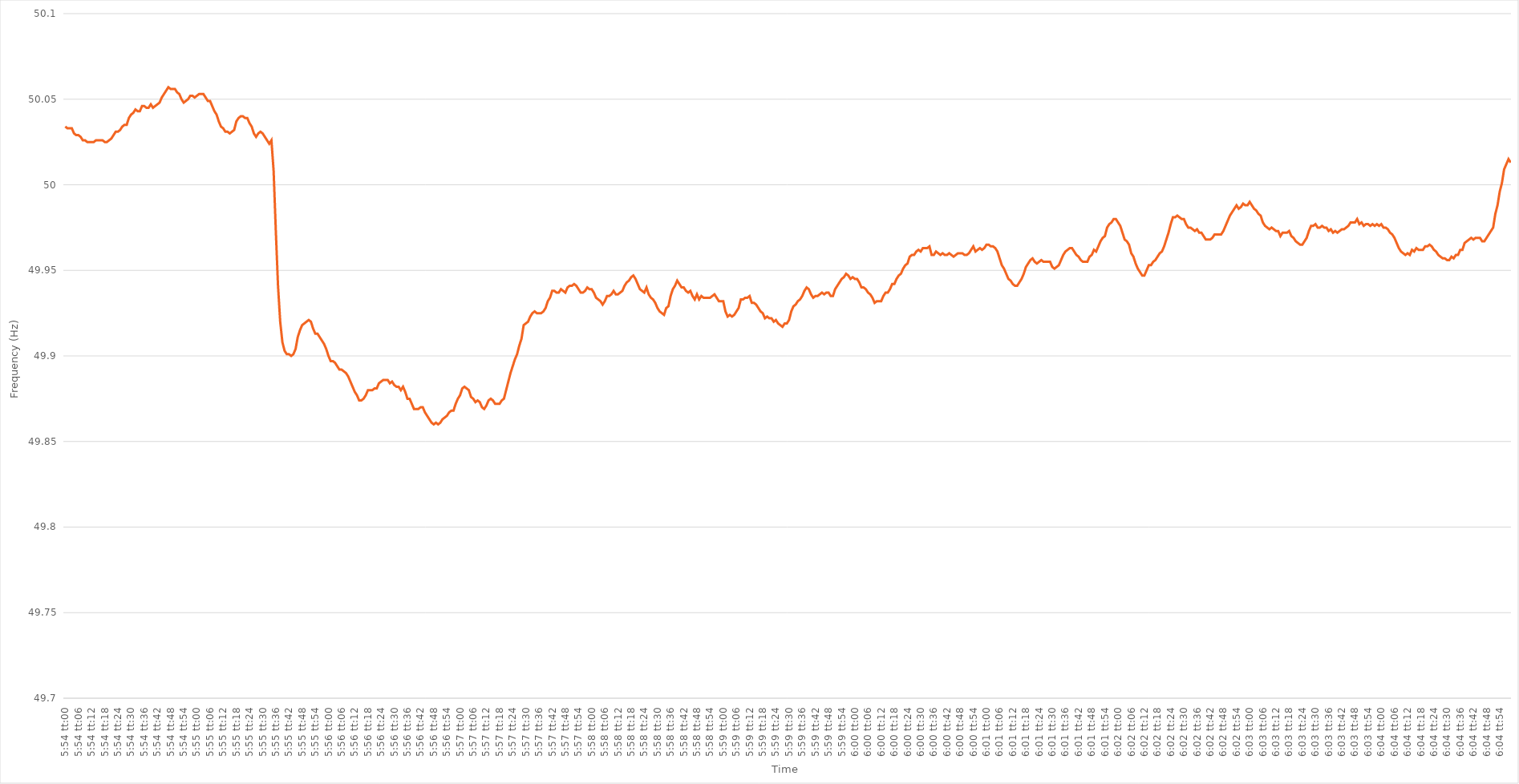
| Category | Series 0 |
|---|---|
| 0.24583333333333335 | 50.034 |
| 0.2458449074074074 | 50.033 |
| 0.2458564814814815 | 50.033 |
| 0.24586805555555555 | 50.033 |
| 0.24587962962962964 | 50.03 |
| 0.24589120370370368 | 50.029 |
| 0.24590277777777778 | 50.029 |
| 0.24591435185185184 | 50.028 |
| 0.2459259259259259 | 50.026 |
| 0.2459375 | 50.026 |
| 0.24594907407407407 | 50.025 |
| 0.24596064814814814 | 50.025 |
| 0.24597222222222223 | 50.025 |
| 0.2459837962962963 | 50.025 |
| 0.24599537037037036 | 50.026 |
| 0.24600694444444446 | 50.026 |
| 0.24601851851851853 | 50.026 |
| 0.2460300925925926 | 50.026 |
| 0.2460416666666667 | 50.025 |
| 0.24605324074074075 | 50.025 |
| 0.24606481481481482 | 50.026 |
| 0.24607638888888891 | 50.027 |
| 0.24608796296296295 | 50.029 |
| 0.24609953703703705 | 50.031 |
| 0.24611111111111109 | 50.031 |
| 0.24612268518518518 | 50.032 |
| 0.24613425925925925 | 50.034 |
| 0.2461458333333333 | 50.035 |
| 0.2461574074074074 | 50.035 |
| 0.24616898148148147 | 50.039 |
| 0.24618055555555554 | 50.041 |
| 0.24619212962962964 | 50.042 |
| 0.2462037037037037 | 50.044 |
| 0.24621527777777777 | 50.043 |
| 0.24622685185185186 | 50.043 |
| 0.24623842592592593 | 50.046 |
| 0.24625 | 50.046 |
| 0.2462615740740741 | 50.045 |
| 0.24627314814814816 | 50.045 |
| 0.24628472222222222 | 50.047 |
| 0.24629629629629632 | 50.045 |
| 0.24630787037037036 | 50.046 |
| 0.24631944444444445 | 50.047 |
| 0.2463310185185185 | 50.048 |
| 0.2463425925925926 | 50.051 |
| 0.24635416666666665 | 50.053 |
| 0.24636574074074072 | 50.055 |
| 0.2463773148148148 | 50.057 |
| 0.24638888888888888 | 50.056 |
| 0.24640046296296295 | 50.056 |
| 0.24641203703703704 | 50.056 |
| 0.2464236111111111 | 50.054 |
| 0.24643518518518517 | 50.053 |
| 0.24644675925925927 | 50.05 |
| 0.24645833333333333 | 50.048 |
| 0.2464699074074074 | 50.049 |
| 0.2464814814814815 | 50.05 |
| 0.24649305555555556 | 50.052 |
| 0.24650462962962963 | 50.052 |
| 0.24651620370370372 | 50.051 |
| 0.2465277777777778 | 50.052 |
| 0.24653935185185186 | 50.053 |
| 0.2465509259259259 | 50.053 |
| 0.24656250000000002 | 50.053 |
| 0.24657407407407406 | 50.051 |
| 0.24658564814814818 | 50.049 |
| 0.24659722222222222 | 50.049 |
| 0.24660879629629628 | 50.046 |
| 0.24662037037037035 | 50.043 |
| 0.24663194444444445 | 50.041 |
| 0.2466435185185185 | 50.037 |
| 0.24665509259259258 | 50.034 |
| 0.24666666666666667 | 50.033 |
| 0.24667824074074074 | 50.031 |
| 0.2466898148148148 | 50.031 |
| 0.2467013888888889 | 50.03 |
| 0.24671296296296297 | 50.031 |
| 0.24672453703703703 | 50.032 |
| 0.24673611111111113 | 50.037 |
| 0.2467476851851852 | 50.039 |
| 0.24675925925925926 | 50.04 |
| 0.24677083333333336 | 50.04 |
| 0.24678240740740742 | 50.039 |
| 0.24679398148148146 | 50.039 |
| 0.24680555555555558 | 50.036 |
| 0.24681712962962962 | 50.034 |
| 0.2468287037037037 | 50.03 |
| 0.24684027777777776 | 50.028 |
| 0.24685185185185185 | 50.03 |
| 0.24686342592592592 | 50.031 |
| 0.24687499999999998 | 50.03 |
| 0.24688657407407408 | 50.028 |
| 0.24689814814814814 | 50.026 |
| 0.2469097222222222 | 50.024 |
| 0.2469212962962963 | 50.026 |
| 0.24693287037037037 | 50.008 |
| 0.24694444444444444 | 49.973 |
| 0.24695601851851853 | 49.941 |
| 0.2469675925925926 | 49.92 |
| 0.24697916666666667 | 49.908 |
| 0.24699074074074076 | 49.903 |
| 0.24700231481481483 | 49.901 |
| 0.2470138888888889 | 49.901 |
| 0.247025462962963 | 49.9 |
| 0.24703703703703703 | 49.901 |
| 0.24704861111111112 | 49.904 |
| 0.24706018518518516 | 49.911 |
| 0.24707175925925925 | 49.915 |
| 0.24708333333333332 | 49.918 |
| 0.2470949074074074 | 49.919 |
| 0.24710648148148148 | 49.92 |
| 0.24711805555555555 | 49.921 |
| 0.24712962962962962 | 49.92 |
| 0.2471412037037037 | 49.916 |
| 0.24715277777777778 | 49.913 |
| 0.24716435185185184 | 49.913 |
| 0.24717592592592594 | 49.911 |
| 0.2471875 | 49.909 |
| 0.24719907407407407 | 49.907 |
| 0.24721064814814817 | 49.904 |
| 0.24722222222222223 | 49.9 |
| 0.2472337962962963 | 49.897 |
| 0.2472453703703704 | 49.897 |
| 0.24725694444444443 | 49.896 |
| 0.24726851851851853 | 49.894 |
| 0.24728009259259257 | 49.892 |
| 0.2472916666666667 | 49.892 |
| 0.24730324074074073 | 49.891 |
| 0.2473148148148148 | 49.89 |
| 0.2473263888888889 | 49.888 |
| 0.24733796296296295 | 49.885 |
| 0.24734953703703702 | 49.882 |
| 0.24736111111111111 | 49.879 |
| 0.24737268518518518 | 49.877 |
| 0.24738425925925925 | 49.874 |
| 0.24739583333333334 | 49.874 |
| 0.2474074074074074 | 49.875 |
| 0.24741898148148148 | 49.877 |
| 0.24743055555555557 | 49.88 |
| 0.24744212962962964 | 49.88 |
| 0.2474537037037037 | 49.88 |
| 0.2474652777777778 | 49.881 |
| 0.24747685185185186 | 49.881 |
| 0.24748842592592593 | 49.884 |
| 0.24749999999999997 | 49.885 |
| 0.2475115740740741 | 49.886 |
| 0.24752314814814813 | 49.886 |
| 0.24753472222222225 | 49.886 |
| 0.2475462962962963 | 49.884 |
| 0.24755787037037036 | 49.885 |
| 0.24756944444444443 | 49.883 |
| 0.24758101851851852 | 49.882 |
| 0.2475925925925926 | 49.882 |
| 0.24760416666666665 | 49.88 |
| 0.24761574074074075 | 49.882 |
| 0.24762731481481481 | 49.879 |
| 0.24763888888888888 | 49.875 |
| 0.24765046296296298 | 49.875 |
| 0.24766203703703704 | 49.872 |
| 0.2476736111111111 | 49.869 |
| 0.2476851851851852 | 49.869 |
| 0.24769675925925927 | 49.869 |
| 0.24770833333333334 | 49.87 |
| 0.24771990740740743 | 49.87 |
| 0.2477314814814815 | 49.867 |
| 0.24774305555555554 | 49.865 |
| 0.24775462962962966 | 49.863 |
| 0.2477662037037037 | 49.861 |
| 0.24777777777777776 | 49.86 |
| 0.24778935185185183 | 49.861 |
| 0.24780092592592592 | 49.86 |
| 0.2478125 | 49.861 |
| 0.24782407407407406 | 49.863 |
| 0.24783564814814815 | 49.864 |
| 0.24784722222222222 | 49.865 |
| 0.24785879629629629 | 49.867 |
| 0.24787037037037038 | 49.868 |
| 0.24788194444444445 | 49.868 |
| 0.2478935185185185 | 49.872 |
| 0.2479050925925926 | 49.875 |
| 0.24791666666666667 | 49.877 |
| 0.24792824074074074 | 49.881 |
| 0.24793981481481484 | 49.882 |
| 0.2479513888888889 | 49.881 |
| 0.24796296296296297 | 49.88 |
| 0.24797453703703706 | 49.876 |
| 0.2479861111111111 | 49.875 |
| 0.2479976851851852 | 49.873 |
| 0.24800925925925923 | 49.874 |
| 0.24802083333333333 | 49.873 |
| 0.2480324074074074 | 49.87 |
| 0.24804398148148146 | 49.869 |
| 0.24805555555555556 | 49.871 |
| 0.24806712962962962 | 49.874 |
| 0.2480787037037037 | 49.875 |
| 0.24809027777777778 | 49.874 |
| 0.24810185185185185 | 49.872 |
| 0.24811342592592592 | 49.872 |
| 0.248125 | 49.872 |
| 0.24813657407407408 | 49.874 |
| 0.24814814814814815 | 49.875 |
| 0.24815972222222224 | 49.88 |
| 0.2481712962962963 | 49.885 |
| 0.24818287037037037 | 49.89 |
| 0.24819444444444447 | 49.894 |
| 0.2482060185185185 | 49.898 |
| 0.2482175925925926 | 49.901 |
| 0.24822916666666664 | 49.906 |
| 0.24824074074074076 | 49.91 |
| 0.2482523148148148 | 49.918 |
| 0.24826388888888887 | 49.919 |
| 0.24827546296296296 | 49.92 |
| 0.24828703703703703 | 49.923 |
| 0.2482986111111111 | 49.925 |
| 0.2483101851851852 | 49.926 |
| 0.24832175925925926 | 49.925 |
| 0.24833333333333332 | 49.925 |
| 0.24834490740740742 | 49.925 |
| 0.24835648148148148 | 49.926 |
| 0.24836805555555555 | 49.928 |
| 0.24837962962962964 | 49.932 |
| 0.2483912037037037 | 49.934 |
| 0.24840277777777778 | 49.938 |
| 0.24841435185185187 | 49.938 |
| 0.24842592592592594 | 49.937 |
| 0.2484375 | 49.937 |
| 0.24844907407407404 | 49.939 |
| 0.24846064814814817 | 49.938 |
| 0.2484722222222222 | 49.937 |
| 0.24848379629629633 | 49.94 |
| 0.24849537037037037 | 49.941 |
| 0.24850694444444443 | 49.941 |
| 0.2485185185185185 | 49.942 |
| 0.2485300925925926 | 49.941 |
| 0.24854166666666666 | 49.939 |
| 0.24855324074074073 | 49.937 |
| 0.24856481481481482 | 49.937 |
| 0.2485763888888889 | 49.938 |
| 0.24858796296296296 | 49.94 |
| 0.24859953703703705 | 49.939 |
| 0.24861111111111112 | 49.939 |
| 0.24862268518518518 | 49.937 |
| 0.24863425925925928 | 49.934 |
| 0.24864583333333334 | 49.933 |
| 0.2486574074074074 | 49.932 |
| 0.2486689814814815 | 49.93 |
| 0.24868055555555557 | 49.932 |
| 0.2486921296296296 | 49.935 |
| 0.24870370370370373 | 49.935 |
| 0.24871527777777777 | 49.936 |
| 0.24872685185185184 | 49.938 |
| 0.2487384259259259 | 49.936 |
| 0.24875 | 49.936 |
| 0.24876157407407407 | 49.937 |
| 0.24877314814814813 | 49.938 |
| 0.24878472222222223 | 49.941 |
| 0.2487962962962963 | 49.943 |
| 0.24880787037037036 | 49.944 |
| 0.24881944444444445 | 49.946 |
| 0.24883101851851852 | 49.947 |
| 0.2488425925925926 | 49.945 |
| 0.24885416666666668 | 49.942 |
| 0.24886574074074075 | 49.939 |
| 0.24887731481481482 | 49.938 |
| 0.2488888888888889 | 49.937 |
| 0.24890046296296298 | 49.94 |
| 0.24891203703703701 | 49.936 |
| 0.24892361111111114 | 49.934 |
| 0.24893518518518518 | 49.933 |
| 0.24894675925925927 | 49.931 |
| 0.2489583333333333 | 49.928 |
| 0.2489699074074074 | 49.926 |
| 0.24898148148148147 | 49.925 |
| 0.24899305555555554 | 49.924 |
| 0.24900462962962963 | 49.928 |
| 0.2490162037037037 | 49.929 |
| 0.24902777777777776 | 49.935 |
| 0.24903935185185186 | 49.939 |
| 0.24905092592592593 | 49.941 |
| 0.2490625 | 49.944 |
| 0.2490740740740741 | 49.942 |
| 0.24908564814814815 | 49.94 |
| 0.24909722222222222 | 49.94 |
| 0.24910879629629631 | 49.938 |
| 0.24912037037037038 | 49.937 |
| 0.24913194444444445 | 49.938 |
| 0.24914351851851854 | 49.935 |
| 0.24915509259259258 | 49.933 |
| 0.24916666666666668 | 49.936 |
| 0.24917824074074071 | 49.933 |
| 0.24918981481481484 | 49.935 |
| 0.24920138888888888 | 49.934 |
| 0.24921296296296294 | 49.934 |
| 0.24922453703703704 | 49.934 |
| 0.2492361111111111 | 49.934 |
| 0.24924768518518517 | 49.935 |
| 0.24925925925925926 | 49.936 |
| 0.24927083333333333 | 49.934 |
| 0.2492824074074074 | 49.932 |
| 0.2492939814814815 | 49.932 |
| 0.24930555555555556 | 49.932 |
| 0.24931712962962962 | 49.926 |
| 0.24932870370370372 | 49.923 |
| 0.24934027777777779 | 49.924 |
| 0.24935185185185185 | 49.923 |
| 0.24936342592592595 | 49.924 |
| 0.249375 | 49.926 |
| 0.24938657407407408 | 49.928 |
| 0.24939814814814812 | 49.933 |
| 0.24940972222222224 | 49.933 |
| 0.24942129629629628 | 49.934 |
| 0.24943287037037035 | 49.934 |
| 0.24944444444444444 | 49.935 |
| 0.2494560185185185 | 49.931 |
| 0.24946759259259257 | 49.931 |
| 0.24947916666666667 | 49.93 |
| 0.24949074074074074 | 49.928 |
| 0.2495023148148148 | 49.926 |
| 0.2495138888888889 | 49.925 |
| 0.24952546296296296 | 49.922 |
| 0.24953703703703703 | 49.923 |
| 0.24954861111111112 | 49.922 |
| 0.2495601851851852 | 49.922 |
| 0.24957175925925926 | 49.92 |
| 0.24958333333333335 | 49.921 |
| 0.24959490740740742 | 49.919 |
| 0.24960648148148148 | 49.918 |
| 0.24961805555555558 | 49.917 |
| 0.24962962962962965 | 49.919 |
| 0.24964120370370368 | 49.919 |
| 0.2496527777777778 | 49.921 |
| 0.24966435185185185 | 49.926 |
| 0.2496759259259259 | 49.929 |
| 0.24968749999999998 | 49.93 |
| 0.24969907407407407 | 49.932 |
| 0.24971064814814814 | 49.933 |
| 0.2497222222222222 | 49.935 |
| 0.2497337962962963 | 49.938 |
| 0.24974537037037037 | 49.94 |
| 0.24975694444444443 | 49.939 |
| 0.24976851851851853 | 49.936 |
| 0.2497800925925926 | 49.934 |
| 0.24979166666666666 | 49.935 |
| 0.24980324074074076 | 49.935 |
| 0.24981481481481482 | 49.936 |
| 0.2498263888888889 | 49.937 |
| 0.24983796296296298 | 49.936 |
| 0.24984953703703705 | 49.937 |
| 0.2498611111111111 | 49.937 |
| 0.2498726851851852 | 49.935 |
| 0.24988425925925925 | 49.935 |
| 0.24989583333333334 | 49.939 |
| 0.24990740740740738 | 49.941 |
| 0.24991898148148148 | 49.943 |
| 0.24993055555555554 | 49.945 |
| 0.2499421296296296 | 49.946 |
| 0.2499537037037037 | 49.948 |
| 0.24996527777777777 | 49.947 |
| 0.24997685185185184 | 49.945 |
| 0.24998842592592593 | 49.946 |
| 0.25 | 49.945 |
| 0.2500115740740741 | 49.945 |
| 0.25002314814814813 | 49.943 |
| 0.2500347222222222 | 49.94 |
| 0.2500462962962963 | 49.94 |
| 0.25005787037037036 | 49.939 |
| 0.25006944444444446 | 49.937 |
| 0.25008101851851855 | 49.936 |
| 0.2500925925925926 | 49.934 |
| 0.2501041666666667 | 49.931 |
| 0.2501157407407408 | 49.932 |
| 0.2501273148148148 | 49.932 |
| 0.25013888888888886 | 49.932 |
| 0.25015046296296295 | 49.935 |
| 0.25016203703703704 | 49.937 |
| 0.2501736111111111 | 49.937 |
| 0.2501851851851852 | 49.939 |
| 0.25019675925925927 | 49.942 |
| 0.2502083333333333 | 49.942 |
| 0.2502199074074074 | 49.945 |
| 0.2502314814814815 | 49.947 |
| 0.25024305555555554 | 49.948 |
| 0.25025462962962963 | 49.951 |
| 0.2502662037037037 | 49.953 |
| 0.25027777777777777 | 49.954 |
| 0.25028935185185186 | 49.958 |
| 0.25030092592592595 | 49.959 |
| 0.2503125 | 49.959 |
| 0.2503240740740741 | 49.961 |
| 0.2503356481481482 | 49.962 |
| 0.2503472222222222 | 49.961 |
| 0.25035879629629626 | 49.963 |
| 0.25037037037037035 | 49.963 |
| 0.25038194444444445 | 49.963 |
| 0.2503935185185185 | 49.964 |
| 0.2504050925925926 | 49.959 |
| 0.2504166666666667 | 49.959 |
| 0.2504282407407407 | 49.961 |
| 0.2504398148148148 | 49.96 |
| 0.2504513888888889 | 49.959 |
| 0.25046296296296294 | 49.96 |
| 0.25047453703703704 | 49.959 |
| 0.25048611111111113 | 49.959 |
| 0.25049768518518517 | 49.96 |
| 0.25050925925925926 | 49.959 |
| 0.25052083333333336 | 49.958 |
| 0.2505324074074074 | 49.959 |
| 0.2505439814814815 | 49.96 |
| 0.2505555555555556 | 49.96 |
| 0.2505671296296296 | 49.96 |
| 0.2505787037037037 | 49.959 |
| 0.2505902777777778 | 49.959 |
| 0.25060185185185185 | 49.96 |
| 0.2506134259259259 | 49.962 |
| 0.250625 | 49.964 |
| 0.2506365740740741 | 49.961 |
| 0.2506481481481481 | 49.962 |
| 0.2506597222222222 | 49.963 |
| 0.2506712962962963 | 49.962 |
| 0.25068287037037035 | 49.963 |
| 0.25069444444444444 | 49.965 |
| 0.25070601851851854 | 49.965 |
| 0.2507175925925926 | 49.964 |
| 0.25072916666666667 | 49.964 |
| 0.25074074074074076 | 49.963 |
| 0.2507523148148148 | 49.961 |
| 0.2507638888888889 | 49.957 |
| 0.250775462962963 | 49.953 |
| 0.25078703703703703 | 49.951 |
| 0.2507986111111111 | 49.948 |
| 0.2508101851851852 | 49.945 |
| 0.25082175925925926 | 49.944 |
| 0.2508333333333333 | 49.942 |
| 0.2508449074074074 | 49.941 |
| 0.2508564814814815 | 49.941 |
| 0.2508680555555555 | 49.943 |
| 0.2508796296296296 | 49.945 |
| 0.2508912037037037 | 49.948 |
| 0.25090277777777775 | 49.952 |
| 0.25091435185185185 | 49.954 |
| 0.25092592592592594 | 49.956 |
| 0.2509375 | 49.957 |
| 0.2509490740740741 | 49.955 |
| 0.25096064814814817 | 49.954 |
| 0.2509722222222222 | 49.955 |
| 0.2509837962962963 | 49.956 |
| 0.2509953703703704 | 49.955 |
| 0.25100694444444444 | 49.955 |
| 0.25101851851851853 | 49.955 |
| 0.2510300925925926 | 49.955 |
| 0.25104166666666666 | 49.952 |
| 0.25105324074074076 | 49.951 |
| 0.25106481481481485 | 49.952 |
| 0.2510763888888889 | 49.953 |
| 0.25108796296296293 | 49.956 |
| 0.251099537037037 | 49.959 |
| 0.2511111111111111 | 49.961 |
| 0.25112268518518516 | 49.962 |
| 0.25113425925925925 | 49.963 |
| 0.25114583333333335 | 49.963 |
| 0.2511574074074074 | 49.961 |
| 0.2511689814814815 | 49.959 |
| 0.2511805555555556 | 49.958 |
| 0.2511921296296296 | 49.956 |
| 0.2512037037037037 | 49.955 |
| 0.2512152777777778 | 49.955 |
| 0.25122685185185184 | 49.955 |
| 0.25123842592592593 | 49.958 |
| 0.25125000000000003 | 49.959 |
| 0.25126157407407407 | 49.962 |
| 0.25127314814814816 | 49.961 |
| 0.25128472222222226 | 49.964 |
| 0.2512962962962963 | 49.967 |
| 0.25130787037037033 | 49.969 |
| 0.25131944444444443 | 49.97 |
| 0.2513310185185185 | 49.975 |
| 0.25134259259259256 | 49.977 |
| 0.25135416666666666 | 49.978 |
| 0.25136574074074075 | 49.98 |
| 0.2513773148148148 | 49.98 |
| 0.2513888888888889 | 49.978 |
| 0.251400462962963 | 49.976 |
| 0.251412037037037 | 49.972 |
| 0.2514236111111111 | 49.968 |
| 0.2514351851851852 | 49.967 |
| 0.25144675925925924 | 49.965 |
| 0.25145833333333334 | 49.96 |
| 0.25146990740740743 | 49.958 |
| 0.2514814814814815 | 49.954 |
| 0.25149305555555557 | 49.951 |
| 0.25150462962962966 | 49.949 |
| 0.2515162037037037 | 49.947 |
| 0.2515277777777778 | 49.947 |
| 0.25153935185185183 | 49.95 |
| 0.25155092592592593 | 49.953 |
| 0.25156249999999997 | 49.953 |
| 0.25157407407407406 | 49.955 |
| 0.25158564814814816 | 49.956 |
| 0.2515972222222222 | 49.958 |
| 0.2516087962962963 | 49.96 |
| 0.2516203703703704 | 49.961 |
| 0.2516319444444444 | 49.964 |
| 0.2516435185185185 | 49.968 |
| 0.2516550925925926 | 49.972 |
| 0.25166666666666665 | 49.977 |
| 0.25167824074074074 | 49.981 |
| 0.25168981481481484 | 49.981 |
| 0.2517013888888889 | 49.982 |
| 0.25171296296296297 | 49.981 |
| 0.25172453703703707 | 49.98 |
| 0.2517361111111111 | 49.98 |
| 0.2517476851851852 | 49.977 |
| 0.2517592592592593 | 49.975 |
| 0.25177083333333333 | 49.975 |
| 0.25178240740740737 | 49.974 |
| 0.25179398148148147 | 49.973 |
| 0.25180555555555556 | 49.974 |
| 0.2518171296296296 | 49.972 |
| 0.2518287037037037 | 49.972 |
| 0.2518402777777778 | 49.97 |
| 0.2518518518518518 | 49.968 |
| 0.2518634259259259 | 49.968 |
| 0.251875 | 49.968 |
| 0.25188657407407405 | 49.969 |
| 0.25189814814814815 | 49.971 |
| 0.25190972222222224 | 49.971 |
| 0.2519212962962963 | 49.971 |
| 0.2519328703703704 | 49.971 |
| 0.25194444444444447 | 49.973 |
| 0.2519560185185185 | 49.976 |
| 0.2519675925925926 | 49.979 |
| 0.2519791666666667 | 49.982 |
| 0.25199074074074074 | 49.984 |
| 0.25200231481481483 | 49.986 |
| 0.25201388888888887 | 49.988 |
| 0.25202546296296297 | 49.986 |
| 0.252037037037037 | 49.987 |
| 0.2520486111111111 | 49.989 |
| 0.2520601851851852 | 49.988 |
| 0.25207175925925923 | 49.988 |
| 0.2520833333333333 | 49.99 |
| 0.2520949074074074 | 49.988 |
| 0.25210648148148146 | 49.986 |
| 0.25211805555555555 | 49.985 |
| 0.25212962962962965 | 49.983 |
| 0.2521412037037037 | 49.982 |
| 0.2521527777777778 | 49.978 |
| 0.2521643518518519 | 49.976 |
| 0.2521759259259259 | 49.975 |
| 0.2521875 | 49.974 |
| 0.2521990740740741 | 49.975 |
| 0.25221064814814814 | 49.974 |
| 0.25222222222222224 | 49.973 |
| 0.25223379629629633 | 49.973 |
| 0.25224537037037037 | 49.97 |
| 0.2522569444444444 | 49.972 |
| 0.2522685185185185 | 49.972 |
| 0.2522800925925926 | 49.972 |
| 0.25229166666666664 | 49.973 |
| 0.25230324074074073 | 49.97 |
| 0.2523148148148148 | 49.969 |
| 0.25232638888888886 | 49.967 |
| 0.25233796296296296 | 49.966 |
| 0.25234953703703705 | 49.965 |
| 0.2523611111111111 | 49.965 |
| 0.2523726851851852 | 49.967 |
| 0.2523842592592593 | 49.969 |
| 0.2523958333333333 | 49.973 |
| 0.2524074074074074 | 49.976 |
| 0.2524189814814815 | 49.976 |
| 0.25243055555555555 | 49.977 |
| 0.25244212962962964 | 49.975 |
| 0.25245370370370374 | 49.975 |
| 0.2524652777777778 | 49.976 |
| 0.25247685185185187 | 49.975 |
| 0.2524884259259259 | 49.975 |
| 0.2525 | 49.973 |
| 0.25251157407407404 | 49.974 |
| 0.25252314814814814 | 49.972 |
| 0.25253472222222223 | 49.973 |
| 0.25254629629629627 | 49.972 |
| 0.25255787037037036 | 49.973 |
| 0.25256944444444446 | 49.974 |
| 0.2525810185185185 | 49.974 |
| 0.2525925925925926 | 49.975 |
| 0.2526041666666667 | 49.976 |
| 0.2526157407407407 | 49.978 |
| 0.2526273148148148 | 49.978 |
| 0.2526388888888889 | 49.978 |
| 0.25265046296296295 | 49.98 |
| 0.25266203703703705 | 49.977 |
| 0.25267361111111114 | 49.978 |
| 0.2526851851851852 | 49.976 |
| 0.2526967592592593 | 49.977 |
| 0.25270833333333337 | 49.977 |
| 0.2527199074074074 | 49.976 |
| 0.25273148148148145 | 49.977 |
| 0.25274305555555554 | 49.976 |
| 0.25275462962962963 | 49.977 |
| 0.2527662037037037 | 49.976 |
| 0.25277777777777777 | 49.977 |
| 0.25278935185185186 | 49.975 |
| 0.2528009259259259 | 49.975 |
| 0.2528125 | 49.974 |
| 0.2528240740740741 | 49.972 |
| 0.25283564814814813 | 49.971 |
| 0.2528472222222222 | 49.969 |
| 0.2528587962962963 | 49.966 |
| 0.25287037037037036 | 49.963 |
| 0.25288194444444445 | 49.961 |
| 0.25289351851851855 | 49.96 |
| 0.2529050925925926 | 49.959 |
| 0.2529166666666667 | 49.96 |
| 0.2529282407407408 | 49.959 |
| 0.2529398148148148 | 49.962 |
| 0.2529513888888889 | 49.961 |
| 0.25296296296296295 | 49.963 |
| 0.25297453703703704 | 49.962 |
| 0.2529861111111111 | 49.962 |
| 0.2529976851851852 | 49.962 |
| 0.25300925925925927 | 49.964 |
| 0.2530208333333333 | 49.964 |
| 0.2530324074074074 | 49.965 |
| 0.2530439814814815 | 49.964 |
| 0.25305555555555553 | 49.962 |
| 0.25306712962962963 | 49.961 |
| 0.2530787037037037 | 49.959 |
| 0.25309027777777776 | 49.958 |
| 0.25310185185185186 | 49.957 |
| 0.25311342592592595 | 49.957 |
| 0.253125 | 49.956 |
| 0.2531365740740741 | 49.956 |
| 0.2531481481481482 | 49.958 |
| 0.2531597222222222 | 49.957 |
| 0.2531712962962963 | 49.959 |
| 0.2531828703703704 | 49.959 |
| 0.25319444444444444 | 49.962 |
| 0.2532060185185185 | 49.962 |
| 0.2532175925925926 | 49.966 |
| 0.25322916666666667 | 49.967 |
| 0.2532407407407407 | 49.968 |
| 0.2532523148148148 | 49.969 |
| 0.2532638888888889 | 49.968 |
| 0.25327546296296294 | 49.969 |
| 0.25328703703703703 | 49.969 |
| 0.2532986111111111 | 49.969 |
| 0.25331018518518517 | 49.967 |
| 0.25332175925925926 | 49.967 |
| 0.25333333333333335 | 49.969 |
| 0.2533449074074074 | 49.971 |
| 0.2533564814814815 | 49.973 |
| 0.2533680555555556 | 49.975 |
| 0.2533796296296296 | 49.983 |
| 0.2533912037037037 | 49.988 |
| 0.2534027777777778 | 49.996 |
| 0.25341435185185185 | 50.001 |
| 0.25342592592592594 | 50.009 |
| 0.2534375 | 50.012 |
| 0.2534490740740741 | 50.015 |
| 0.2534606481481481 | 50.013 |